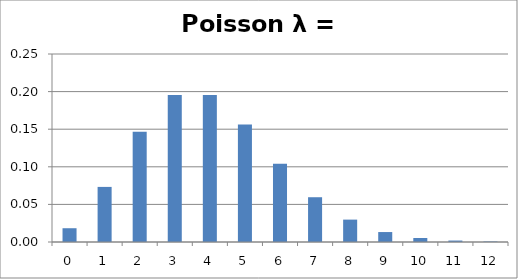
| Category | Series 0 |
|---|---|
| 0.0 | 0.018 |
| 1.0 | 0.073 |
| 2.0 | 0.147 |
| 3.0 | 0.195 |
| 4.0 | 0.195 |
| 5.0 | 0.156 |
| 6.0 | 0.104 |
| 7.0 | 0.06 |
| 8.0 | 0.03 |
| 9.0 | 0.013 |
| 10.0 | 0.005 |
| 11.0 | 0.002 |
| 12.0 | 0.001 |